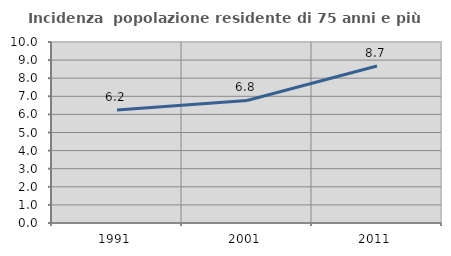
| Category | Incidenza  popolazione residente di 75 anni e più |
|---|---|
| 1991.0 | 6.243 |
| 2001.0 | 6.769 |
| 2011.0 | 8.677 |